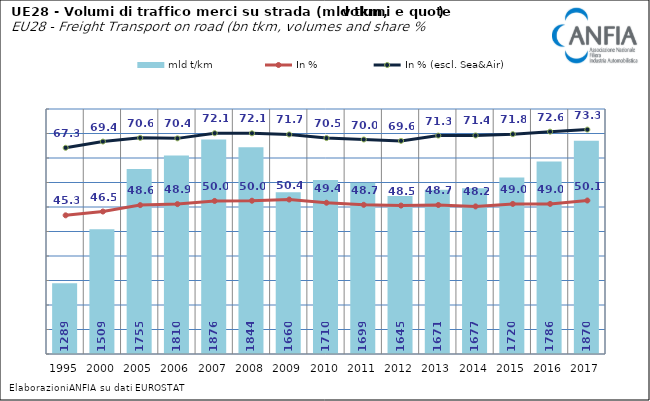
| Category | mld t/km |
|---|---|
| 1995.0 | 1288.66 |
| 2000.0 | 1509.488 |
| 2005.0 | 1755.452 |
| 2006.0 | 1810.292 |
| 2007.0 | 1875.779 |
| 2008.0 | 1844.12 |
| 2009.0 | 1660.321 |
| 2010.0 | 1709.802 |
| 2011.0 | 1699.186 |
| 2012.0 | 1645.087 |
| 2013.0 | 1670.705 |
| 2014.0 | 1677 |
| 2015.0 | 1720 |
| 2016.0 | 1786 |
| 2017.0 | 1870 |